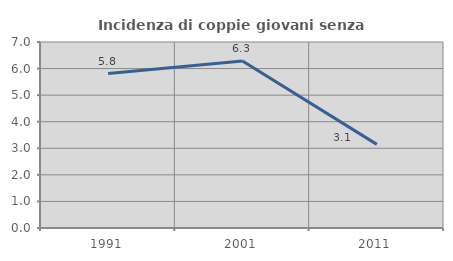
| Category | Incidenza di coppie giovani senza figli |
|---|---|
| 1991.0 | 5.81 |
| 2001.0 | 6.285 |
| 2011.0 | 3.146 |